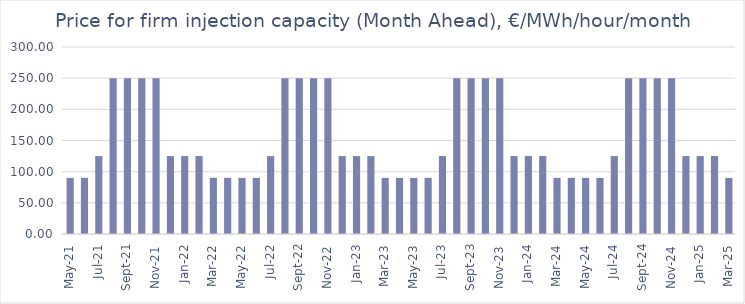
| Category | MA price, €/MWh/hour/month |
|---|---|
| 2021-05-01 | 90 |
| 2021-06-01 | 90 |
| 2021-07-01 | 125 |
| 2021-08-01 | 250 |
| 2021-09-01 | 250 |
| 2021-10-01 | 250 |
| 2021-11-01 | 250 |
| 2021-12-01 | 125 |
| 2022-01-01 | 125 |
| 2022-02-01 | 125 |
| 2022-03-01 | 90 |
| 2022-04-01 | 90 |
| 2022-05-01 | 90 |
| 2022-06-01 | 90 |
| 2022-07-01 | 125 |
| 2022-08-01 | 250 |
| 2022-09-01 | 250 |
| 2022-10-01 | 250 |
| 2022-11-01 | 250 |
| 2022-12-01 | 125 |
| 2023-01-01 | 125 |
| 2023-02-01 | 125 |
| 2023-03-01 | 90 |
| 2023-04-01 | 90 |
| 2023-05-01 | 90 |
| 2023-06-01 | 90 |
| 2023-07-01 | 125 |
| 2023-08-01 | 250 |
| 2023-09-01 | 250 |
| 2023-10-01 | 250 |
| 2023-11-01 | 250 |
| 2023-12-01 | 125 |
| 2024-01-01 | 125 |
| 2024-02-01 | 125 |
| 2024-03-01 | 90 |
| 2024-04-01 | 90 |
| 2024-05-01 | 90 |
| 2024-06-01 | 90 |
| 2024-07-01 | 125 |
| 2024-08-01 | 250 |
| 2024-09-01 | 250 |
| 2024-10-01 | 250 |
| 2024-11-01 | 250 |
| 2024-12-01 | 125 |
| 2025-01-01 | 125 |
| 2025-02-01 | 125 |
| 2025-03-01 | 90 |